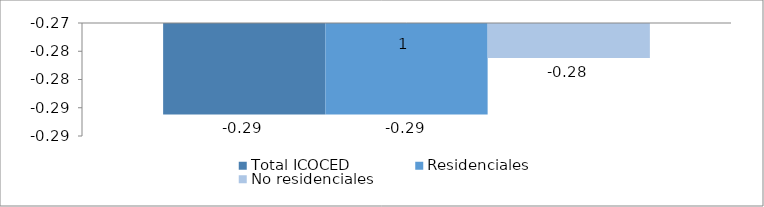
| Category | Total ICOCED | Residenciales | No residenciales |
|---|---|---|---|
| 0 | -0.29 | -0.29 | -0.28 |